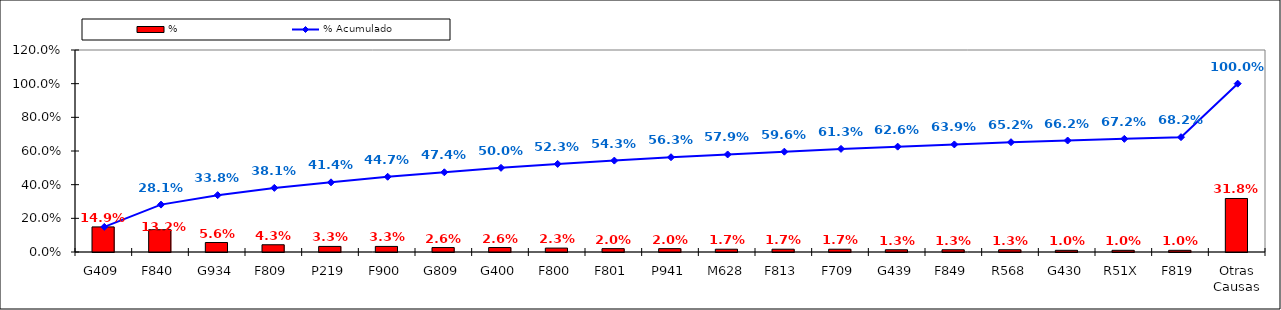
| Category | % |
|---|---|
| G409 | 0.149 |
| F840 | 0.132 |
| G934 | 0.056 |
| F809 | 0.043 |
| P219 | 0.033 |
| F900 | 0.033 |
| G809 | 0.026 |
| G400 | 0.026 |
| F800 | 0.023 |
| F801 | 0.02 |
| P941 | 0.02 |
| M628 | 0.017 |
| F813 | 0.017 |
| F709 | 0.017 |
| G439 | 0.013 |
| F849 | 0.013 |
| R568 | 0.013 |
| G430 | 0.01 |
| R51X | 0.01 |
| F819 | 0.01 |
| Otras Causas | 0.318 |